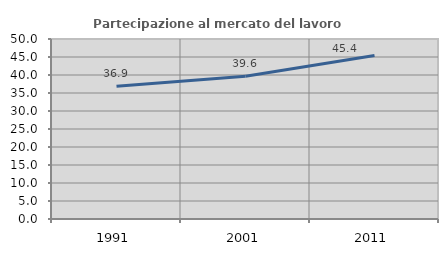
| Category | Partecipazione al mercato del lavoro  femminile |
|---|---|
| 1991.0 | 36.862 |
| 2001.0 | 39.647 |
| 2011.0 | 45.42 |